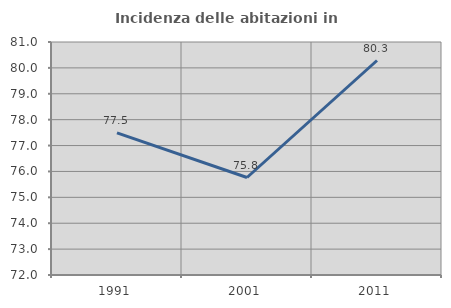
| Category | Incidenza delle abitazioni in proprietà  |
|---|---|
| 1991.0 | 77.492 |
| 2001.0 | 75.766 |
| 2011.0 | 80.285 |